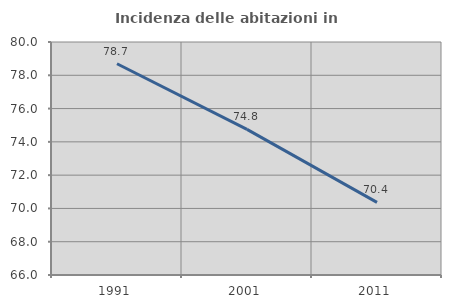
| Category | Incidenza delle abitazioni in proprietà  |
|---|---|
| 1991.0 | 78.695 |
| 2001.0 | 74.75 |
| 2011.0 | 70.366 |